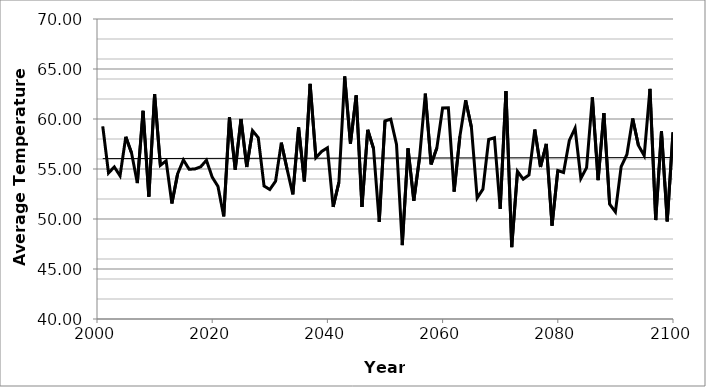
| Category | Committed |
|---|---|
| 2001.0 | 59.268 |
| 2002.0 | 54.595 |
| 2003.0 | 55.209 |
| 2004.0 | 54.32 |
| 2005.0 | 58.221 |
| 2006.0 | 56.595 |
| 2007.0 | 53.591 |
| 2008.0 | 60.823 |
| 2009.0 | 52.239 |
| 2010.0 | 62.49 |
| 2011.0 | 55.368 |
| 2012.0 | 55.818 |
| 2013.0 | 51.557 |
| 2014.0 | 54.522 |
| 2015.0 | 55.909 |
| 2016.0 | 54.973 |
| 2017.0 | 55.004 |
| 2018.0 | 55.22 |
| 2019.0 | 55.875 |
| 2020.0 | 54.185 |
| 2021.0 | 53.265 |
| 2022.0 | 50.263 |
| 2023.0 | 60.165 |
| 2024.0 | 54.93 |
| 2025.0 | 60.001 |
| 2026.0 | 55.2 |
| 2027.0 | 58.834 |
| 2028.0 | 58.131 |
| 2029.0 | 53.303 |
| 2030.0 | 52.948 |
| 2031.0 | 53.775 |
| 2032.0 | 57.632 |
| 2033.0 | 54.993 |
| 2034.0 | 52.455 |
| 2035.0 | 59.151 |
| 2036.0 | 53.766 |
| 2037.0 | 63.514 |
| 2038.0 | 56.131 |
| 2039.0 | 56.761 |
| 2040.0 | 57.123 |
| 2041.0 | 51.213 |
| 2042.0 | 53.665 |
| 2043.0 | 64.254 |
| 2044.0 | 57.533 |
| 2045.0 | 62.368 |
| 2046.0 | 51.199 |
| 2047.0 | 58.921 |
| 2048.0 | 57.061 |
| 2049.0 | 49.721 |
| 2050.0 | 59.805 |
| 2051.0 | 59.983 |
| 2052.0 | 57.45 |
| 2053.0 | 47.388 |
| 2054.0 | 57.056 |
| 2055.0 | 51.831 |
| 2056.0 | 56.143 |
| 2057.0 | 62.533 |
| 2058.0 | 55.45 |
| 2059.0 | 57.112 |
| 2060.0 | 61.093 |
| 2061.0 | 61.111 |
| 2062.0 | 52.729 |
| 2063.0 | 58.262 |
| 2064.0 | 61.876 |
| 2065.0 | 59.189 |
| 2066.0 | 52.095 |
| 2067.0 | 52.984 |
| 2068.0 | 57.949 |
| 2069.0 | 58.129 |
| 2070.0 | 51.008 |
| 2071.0 | 62.785 |
| 2072.0 | 47.187 |
| 2073.0 | 54.765 |
| 2074.0 | 53.992 |
| 2075.0 | 54.397 |
| 2076.0 | 58.941 |
| 2077.0 | 55.202 |
| 2078.0 | 57.502 |
| 2079.0 | 49.329 |
| 2080.0 | 54.844 |
| 2081.0 | 54.646 |
| 2082.0 | 57.857 |
| 2083.0 | 59.079 |
| 2084.0 | 54.05 |
| 2085.0 | 55.134 |
| 2086.0 | 62.159 |
| 2087.0 | 53.893 |
| 2088.0 | 60.595 |
| 2089.0 | 51.489 |
| 2090.0 | 50.707 |
| 2091.0 | 55.234 |
| 2092.0 | 56.457 |
| 2093.0 | 60.055 |
| 2094.0 | 57.342 |
| 2095.0 | 56.345 |
| 2096.0 | 63.007 |
| 2097.0 | 49.896 |
| 2098.0 | 58.777 |
| 2099.0 | 49.766 |
| 2100.0 | 58.667 |